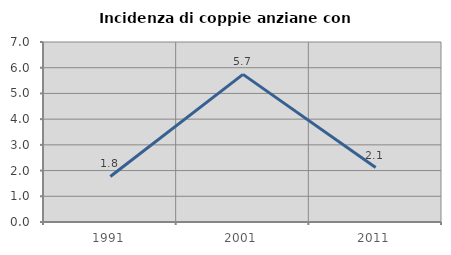
| Category | Incidenza di coppie anziane con figli |
|---|---|
| 1991.0 | 1.77 |
| 2001.0 | 5.742 |
| 2011.0 | 2.116 |